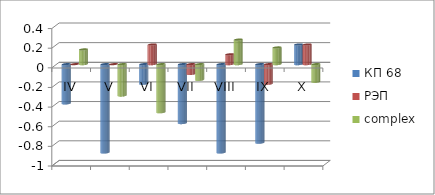
| Category | КП 68 | РЭП  | complex |
|---|---|---|---|
| IV | -0.4 | 0 | 0.15 |
| V | -0.9 | 0 | -0.32 |
| VI | -0.2 | 0.2 | -0.49 |
| VII | -0.6 | -0.1 | -0.16 |
| VIII | -0.9 | 0.1 | 0.25 |
| IX | -0.8 | -0.2 | 0.17 |
| X | 0.2 | 0.2 | -0.18 |